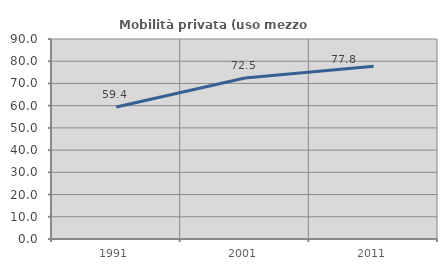
| Category | Mobilità privata (uso mezzo privato) |
|---|---|
| 1991.0 | 59.429 |
| 2001.0 | 72.461 |
| 2011.0 | 77.778 |